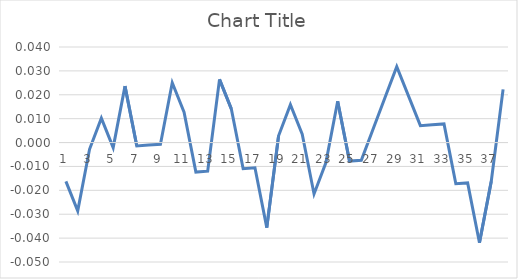
| Category | Series 0 |
|---|---|
| 0 | -0.016 |
| 1 | -0.029 |
| 2 | -0.003 |
| 3 | 0.01 |
| 4 | -0.002 |
| 5 | 0.024 |
| 6 | -0.001 |
| 7 | -0.001 |
| 8 | -0.001 |
| 9 | 0.025 |
| 10 | 0.013 |
| 11 | -0.012 |
| 12 | -0.012 |
| 13 | 0.026 |
| 14 | 0.014 |
| 15 | -0.011 |
| 16 | -0.011 |
| 17 | -0.036 |
| 18 | 0.003 |
| 19 | 0.016 |
| 20 | 0.004 |
| 21 | -0.022 |
| 22 | -0.008 |
| 23 | 0.017 |
| 24 | -0.008 |
| 25 | -0.007 |
| 26 | 0.006 |
| 27 | 0.019 |
| 28 | 0.032 |
| 29 | 0.019 |
| 30 | 0.007 |
| 31 | 0.007 |
| 32 | 0.008 |
| 33 | -0.017 |
| 34 | -0.017 |
| 35 | -0.042 |
| 36 | -0.016 |
| 37 | 0.022 |